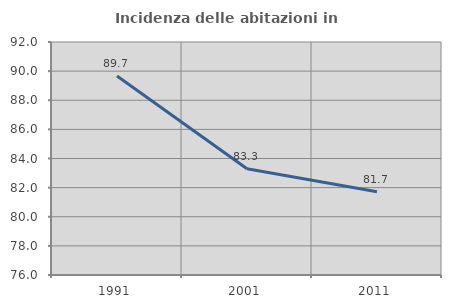
| Category | Incidenza delle abitazioni in proprietà  |
|---|---|
| 1991.0 | 89.669 |
| 2001.0 | 83.302 |
| 2011.0 | 81.722 |